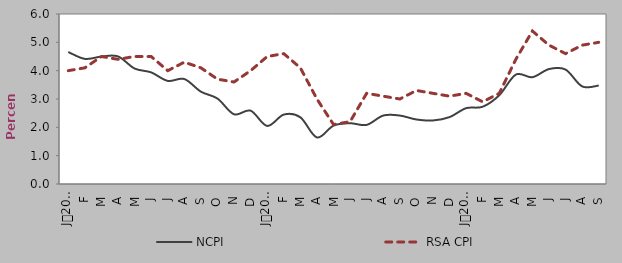
| Category | NCPI | RSA CPI |
|---|---|---|
| 0 | 4.658 | 4 |
| 1900-01-01 | 4.416 | 4.1 |
| 1900-01-02 | 4.498 | 4.5 |
| 1900-01-03 | 4.503 | 4.4 |
| 1900-01-04 | 4.076 | 4.5 |
| 1900-01-05 | 3.939 | 4.5 |
| 1900-01-06 | 3.639 | 4 |
| 1900-01-07 | 3.705 | 4.3 |
| 1900-01-08 | 3.259 | 4.1 |
| 1900-01-09 | 3.015 | 3.7 |
| 1900-01-10 | 2.461 | 3.6 |
| 1900-01-11 | 2.588 | 4 |
| 1900-01-12 | 2.05 | 4.5 |
| 1900-01-13 | 2.45 | 4.6 |
| 1900-01-14 | 2.354 | 4.1 |
| 1900-01-15 | 1.643 | 3 |
| 1900-01-16 | 2.06 | 2.1 |
| 1900-01-17 | 2.145 | 2.2 |
| 1900-01-18 | 2.087 | 3.2 |
| 1900-01-19 | 2.416 | 3.1 |
| 1900-01-20 | 2.416 | 3 |
| 1900-01-21 | 2.277 | 3.3 |
| 1900-01-22 | 2.242 | 3.2 |
| 1900-01-23 | 2.361 | 3.1 |
| 1900-01-24 | 2.676 | 3.2 |
| 1900-01-25 | 2.728 | 2.9 |
| 1900-01-26 | 3.133 | 3.2 |
| 1900-01-27 | 3.861 | 4.4 |
| 1900-01-28 | 3.769 | 5.4 |
| 1900-01-29 | 4.057 | 4.9 |
| 1900-01-30 | 4.038 | 4.6 |
| 1900-01-31 | 3.445 | 4.9 |
| 1900-02-01 | 3.474 | 5 |